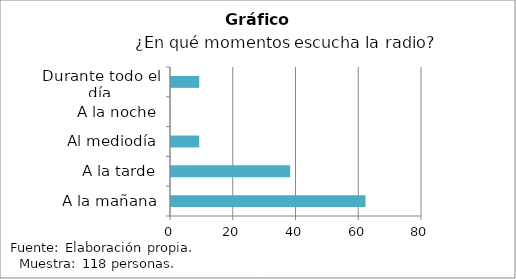
| Category | Series 0 |
|---|---|
| A la mañana | 62 |
| A la tarde | 38 |
| Al mediodía | 9 |
| A la noche | 0 |
| Durante todo el día | 9 |